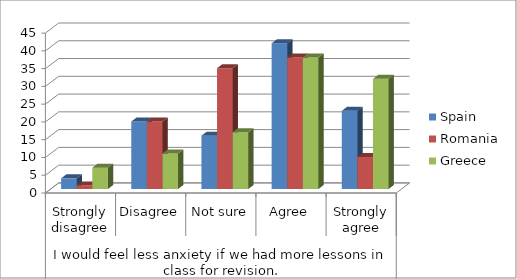
| Category | Spain | Romania | Greece |
|---|---|---|---|
| 0 | 3 | 1 | 6 |
| 1 | 19 | 19 | 10 |
| 2 | 15 | 34 | 16 |
| 3 | 41 | 37 | 37 |
| 4 | 22 | 9 | 31 |